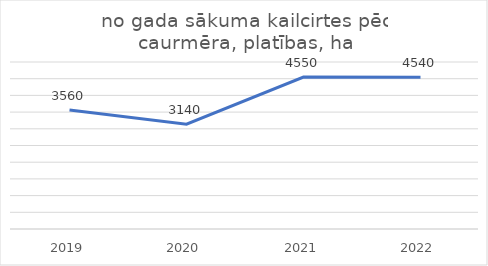
| Category | no gada sākuma kailcirtes pēc caurmēra, platības, ha |
|---|---|
| 2019.0 | 3560 |
| 2020.0 | 3140 |
| 2021.0 | 4550 |
| 2022.0 | 4540 |